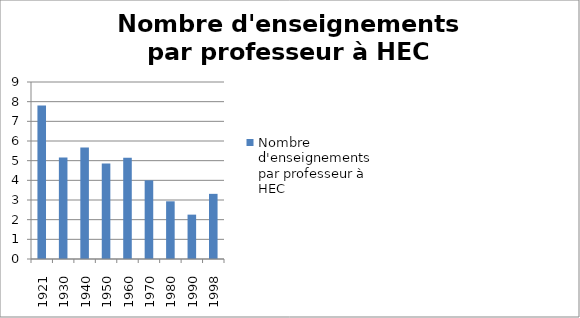
| Category | Nombre d'enseignements par professeur à HEC |
|---|---|
| 1921.0 | 7.8 |
| 1930.0 | 5.167 |
| 1940.0 | 5.667 |
| 1950.0 | 4.857 |
| 1960.0 | 5.143 |
| 1970.0 | 4 |
| 1980.0 | 2.933 |
| 1990.0 | 2.256 |
| 1998.0 | 3.312 |